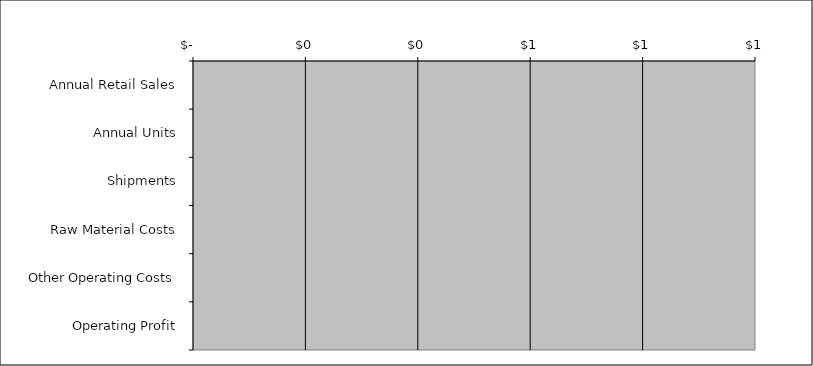
| Category | Series 0 |
|---|---|
| Annual Retail Sales | 0 |
| Annual Units | 0 |
| Shipments | 0 |
| Raw Material Costs | 0 |
| Other Operating Costs | 0 |
| Operating Profit | 0 |